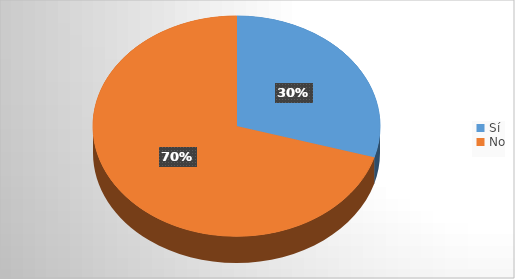
| Category | Series 0 |
|---|---|
| Sí | 21 |
| No | 50 |